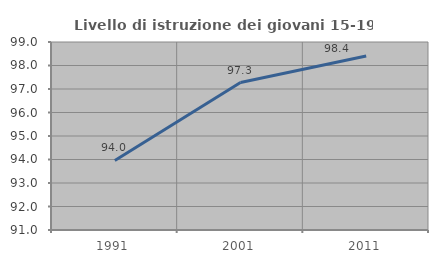
| Category | Livello di istruzione dei giovani 15-19 anni |
|---|---|
| 1991.0 | 93.96 |
| 2001.0 | 97.273 |
| 2011.0 | 98.407 |